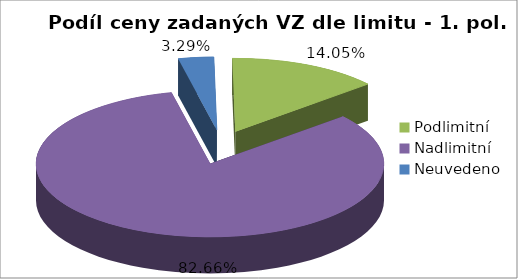
| Category | Series 0 |
|---|---|
| Podlimitní | 18556.394 |
| Nadlimitní | 109164.087 |
| Neuvedeno | 4339.999 |